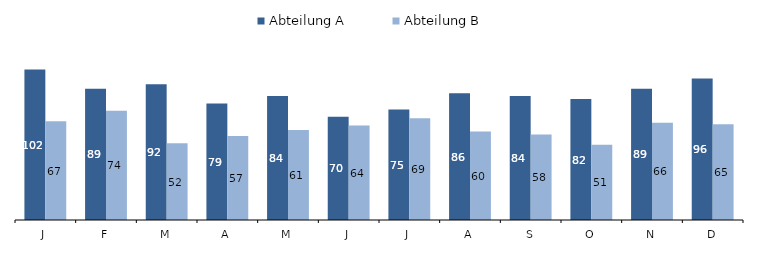
| Category | Abteilung A | Abteilung B |
|---|---|---|
| J | 102 | 67 |
| F | 89 | 74 |
| M | 92 | 52 |
| A | 79 | 57 |
| M | 84 | 61 |
| J | 70 | 64 |
| J | 75 | 69 |
| A | 86 | 60 |
| S | 84 | 58 |
| O | 82 | 51 |
| N | 89 | 66 |
| D | 96 | 65 |